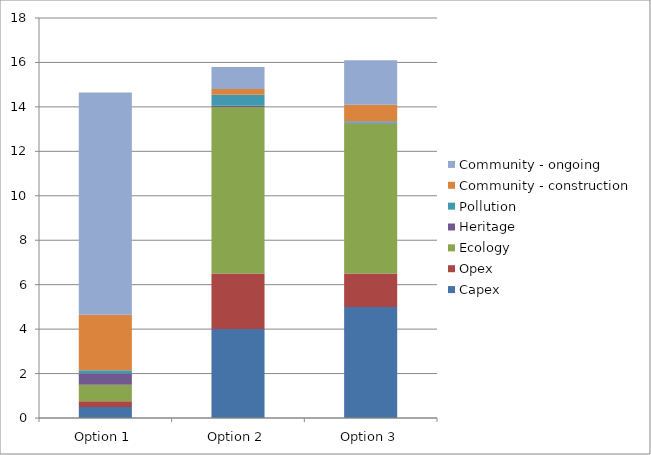
| Category | Capex | Opex | Ecology | Heritage | Pollution | Community - construction | Community - ongoing |
|---|---|---|---|---|---|---|---|
| Option 1 | 0.5 | 0.25 | 0.75 | 0.5 | 0.15 | 2.5 | 10 |
| Option 2 | 4 | 2.5 | 7.5 | 0.05 | 0.5 | 0.25 | 1 |
| Option 3 | 5 | 1.5 | 6.75 | 0.05 | 0.05 | 0.75 | 2 |